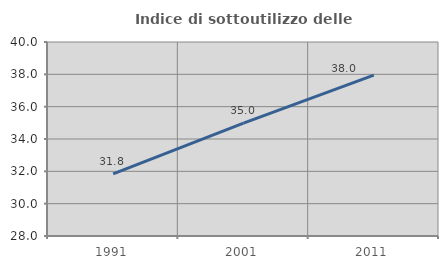
| Category | Indice di sottoutilizzo delle abitazioni  |
|---|---|
| 1991.0 | 31.838 |
| 2001.0 | 34.98 |
| 2011.0 | 37.953 |